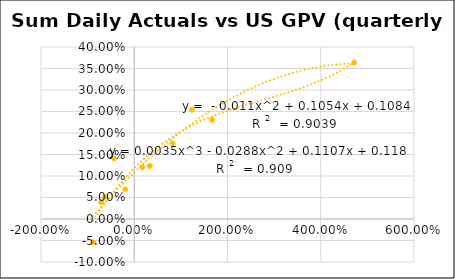
| Category | Series 0 |
|---|---|
| 0.17239811351109124 | 0.121 |
| 0.33404322204095216 | 0.123 |
| 0.821180231164947 | 0.176 |
| 1.2408262626173143 | 0.254 |
| 1.6708591888828779 | 0.231 |
| 4.716588495485591 | 0.364 |
| -0.4329639985031447 | 0.141 |
| -0.6321047553842531 | 0.051 |
| -0.709442159510233 | 0.039 |
| -0.8822239567959241 | -0.054 |
| -0.19201848995045334 | 0.069 |